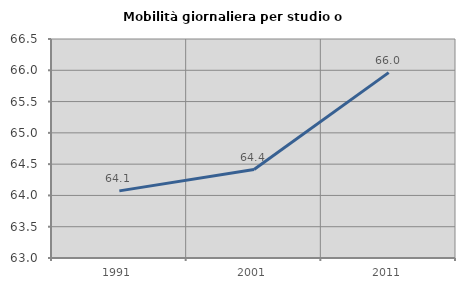
| Category | Mobilità giornaliera per studio o lavoro |
|---|---|
| 1991.0 | 64.073 |
| 2001.0 | 64.413 |
| 2011.0 | 65.962 |